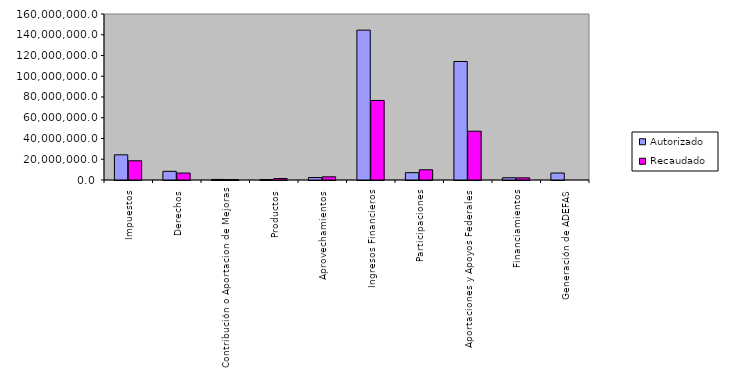
| Category | Autorizado | Recaudado |
|---|---|---|
| 0 | 24258736.4 | 18530262.6 |
| 1 | 8345615.3 | 6673252.1 |
| 2 | 549841.9 | 337913.7 |
| 3 | 412076.9 | 1455775.7 |
| 4 | 2392843.2 | 3068750.8 |
| 5 | 144435639 | 76663262.9 |
| 6 | 7052274.2 | 9842494.6 |
| 7 | 114241050.7 | 47021103.9 |
| 8 | 2195832.7 | 2074667.9 |
| 9 | 6709482.3 | 0 |